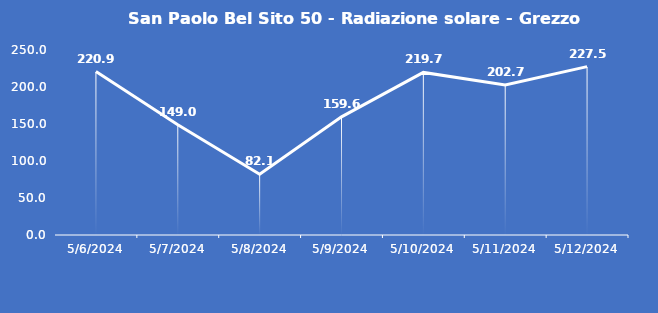
| Category | San Paolo Bel Sito 50 - Radiazione solare - Grezzo (W/m2) |
|---|---|
| 5/6/24 | 220.9 |
| 5/7/24 | 149 |
| 5/8/24 | 82.1 |
| 5/9/24 | 159.6 |
| 5/10/24 | 219.7 |
| 5/11/24 | 202.7 |
| 5/12/24 | 227.5 |